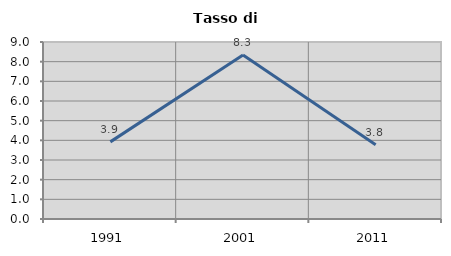
| Category | Tasso di disoccupazione   |
|---|---|
| 1991.0 | 3.922 |
| 2001.0 | 8.333 |
| 2011.0 | 3.774 |